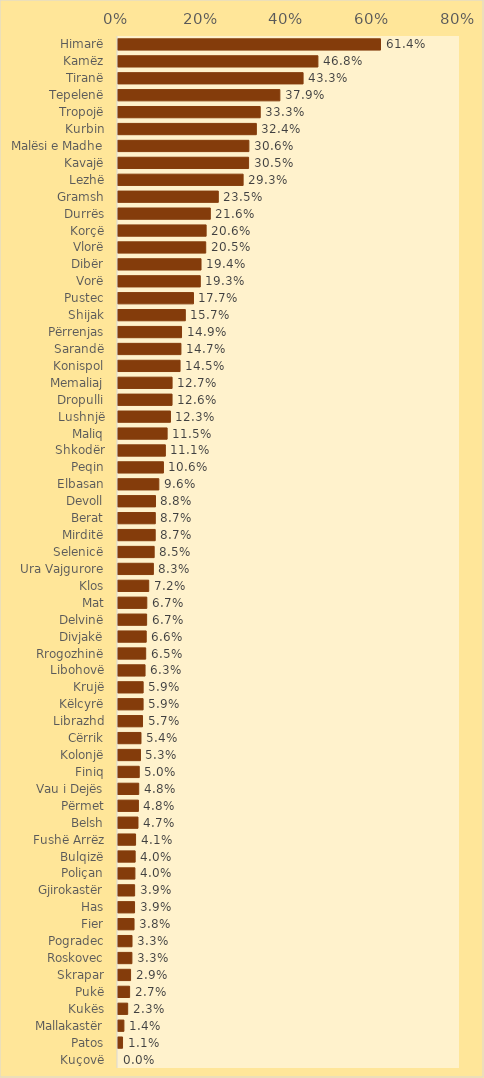
| Category | Series 0 |
|---|---|
| Himarë | 0.614 |
| Kamëz | 0.468 |
| Tiranë | 0.433 |
| Tepelenë | 0.379 |
| Tropojë | 0.333 |
| Kurbin | 0.324 |
| Malësi e Madhe | 0.306 |
| Kavajë | 0.305 |
| Lezhë | 0.293 |
| Gramsh | 0.235 |
| Durrës | 0.216 |
| Korçë | 0.206 |
| Vlorë | 0.205 |
| Dibër | 0.194 |
| Vorë | 0.193 |
| Pustec | 0.177 |
| Shijak | 0.157 |
| Përrenjas | 0.149 |
| Sarandë | 0.147 |
| Konispol | 0.145 |
| Memaliaj | 0.127 |
| Dropulli | 0.126 |
| Lushnjë | 0.123 |
| Maliq | 0.115 |
| Shkodër | 0.111 |
| Peqin | 0.106 |
| Elbasan | 0.096 |
| Devoll | 0.088 |
| Berat | 0.087 |
| Mirditë | 0.087 |
| Selenicë | 0.085 |
| Ura Vajgurore | 0.083 |
| Klos | 0.072 |
| Mat | 0.067 |
| Delvinë | 0.067 |
| Divjakë | 0.066 |
| Rrogozhinë | 0.065 |
| Libohovë | 0.063 |
| Krujë | 0.059 |
| Këlcyrë | 0.059 |
| Librazhd | 0.057 |
| Cërrik | 0.054 |
| Kolonjë | 0.053 |
| Finiq | 0.05 |
| Vau i Dejës | 0.048 |
| Përmet | 0.048 |
| Belsh | 0.047 |
| Fushë Arrëz | 0.041 |
| Bulqizë | 0.04 |
| Poliçan | 0.04 |
| Gjirokastër | 0.039 |
| Has | 0.039 |
| Fier | 0.038 |
| Pogradec | 0.033 |
| Roskovec | 0.033 |
| Skrapar | 0.029 |
| Pukë | 0.027 |
| Kukës | 0.023 |
| Mallakastër | 0.014 |
| Patos | 0.011 |
| Kuçovë | 0 |